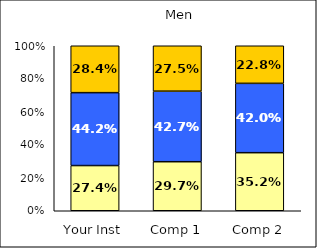
| Category | Low Social Agency | Average Social Agency | High Social Agency |
|---|---|---|---|
| Your Inst | 0.274 | 0.442 | 0.284 |
| Comp 1 | 0.297 | 0.427 | 0.275 |
| Comp 2 | 0.352 | 0.42 | 0.228 |